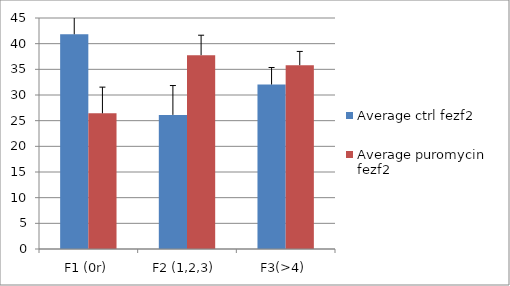
| Category | Average ctrl fezf2 | Average puromycin  fezf2  |
|---|---|---|
| F1 (0r) | 41.83 | 26.433 |
| F2 (1,2,3) | 26.125 | 37.763 |
| F3(>4) | 32.045 | 35.805 |